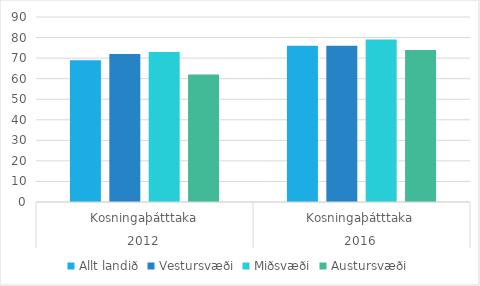
| Category | Allt landið | Vestursvæði | Miðsvæði | Austursvæði |
|---|---|---|---|---|
| 0 | 69 | 72 | 73 | 62 |
| 1 | 76 | 76 | 79 | 74 |